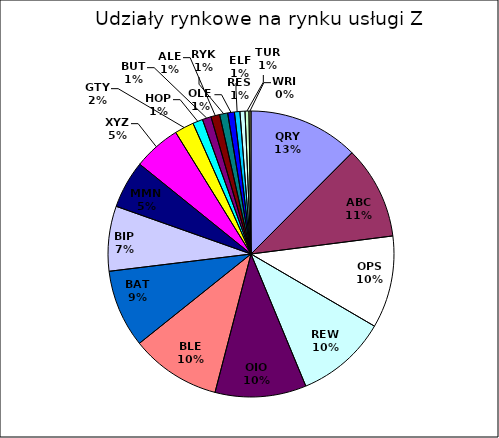
| Category | Sprzedaż |
|---|---|
| QRY | 1100 |
| ABC | 926.542 |
| OPS | 920 |
| REW | 910 |
| OIO | 909.35 |
| BLE | 900 |
| BAT | 777 |
| BIP | 647.453 |
| MMN | 475.7 |
| XYZ | 473.418 |
| GTY | 192.06 |
| HOP | 100 |
| BUT | 88 |
| ALE | 87 |
| RYK | 80.62 |
| OLE | 67 |
| ELF | 54.319 |
| RES | 50.124 |
| TUR | 39.155 |
| WRI | 20 |